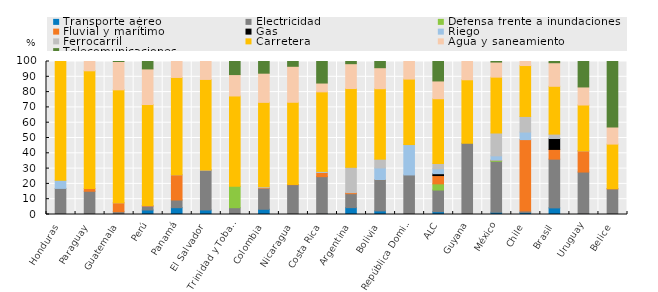
| Category | Transporte aéreo | Electricidad | Defensa frente a inundaciones  | Fluvial y marítimo | Gas | Riego | Ferrocarril | Carretera | Agua y saneamiento | Telecomunicaciones |
|---|---|---|---|---|---|---|---|---|---|---|
| Honduras | 0 | 17.06 | 0 | 0 | 0 | 5.288 | 0 | 77.652 | 0 | 0 |
| Paraguay | 0 | 15.195 | 0 | 1.729 | 0 | 0 | 0 | 76.988 | 6.087 | 0 |
| Guatemala | 0.03 | 1.81 | 0 | 5.817 | 0 | 0 | 0.009 | 73.815 | 18.504 | 0.015 |
| Perú | 2.94 | 2.513 | 0 | 0.31 | 0 | 0 | 0.135 | 65.976 | 23.284 | 4.842 |
| Panamá | 4.452 | 5.019 | 0 | 16.496 | 0 | 0.005 | 0 | 63.613 | 10.414 | 0 |
| El Salvador | 2.956 | 26.051 | 0 | 0.008 | 0 | 0.071 | 0 | 59.197 | 11.717 | 0 |
| Trinidad y Tobago | 0 | 4.437 | 14.042 | 0 | 0 | 0 | 0 | 58.987 | 13.985 | 8.55 |
| Colombia | 3.416 | 13.695 | 0 | 0.391 | 0 | 0.144 | 0.465 | 55.177 | 19.071 | 7.641 |
| Nicaragua | 0 | 19.491 | 0 | 0.168 | 0 | 0 | 0 | 53.69 | 23.515 | 3.136 |
| Costa Rica | 0.458 | 24.266 | 0 | 2.729 | 0 | 0.352 | 0.376 | 51.98 | 5.763 | 14.077 |
| Argentina | 4.484 | 9.127 | 0 | 0.663 | 0 | 0 | 16.568 | 51.489 | 16.245 | 1.424 |
| Bolivia | 2.348 | 20.496 | 0 | 0.013 | 0 | 7.565 | 5.761 | 46.03 | 13.737 | 4.051 |
| República Dominicana | 0 | 25.845 | 0 | 0 | 0 | 19.868 | 0 | 42.791 | 11.496 | 0 |
| ALC | 1.819 | 14.164 | 4.052 | 5.417 | 1.206 | 3.243 | 3.44 | 42.321 | 11.628 | 12.709 |
| Guyana | 0 | 46.571 | 0 | 0 | 0 | 0 | 0 | 41.481 | 11.949 | 0 |
| México | 1.461 | 33.297 | 0.689 | 0.06 | 0 | 2.826 | 14.938 | 36.512 | 9.855 | 0.362 |
| Chile | 1.29 | 0.918 | 0 | 46.736 | 0 | 4.945 | 10.2 | 33.265 | 2.646 | 0 |
| Brasil | 4.316 | 31.868 | 0 | 6.356 | 7.17 | 0.129 | 2.708 | 31.251 | 15.4 | 0.801 |
| Uruguay | 0.322 | 27.423 | 0 | 13.848 | 0 | 0 | 0.038 | 29.934 | 11.797 | 16.638 |
| Belice | 0 | 16.758 | 0 | 0.111 | 0 | 0 | 0 | 29.151 | 11.171 | 42.809 |